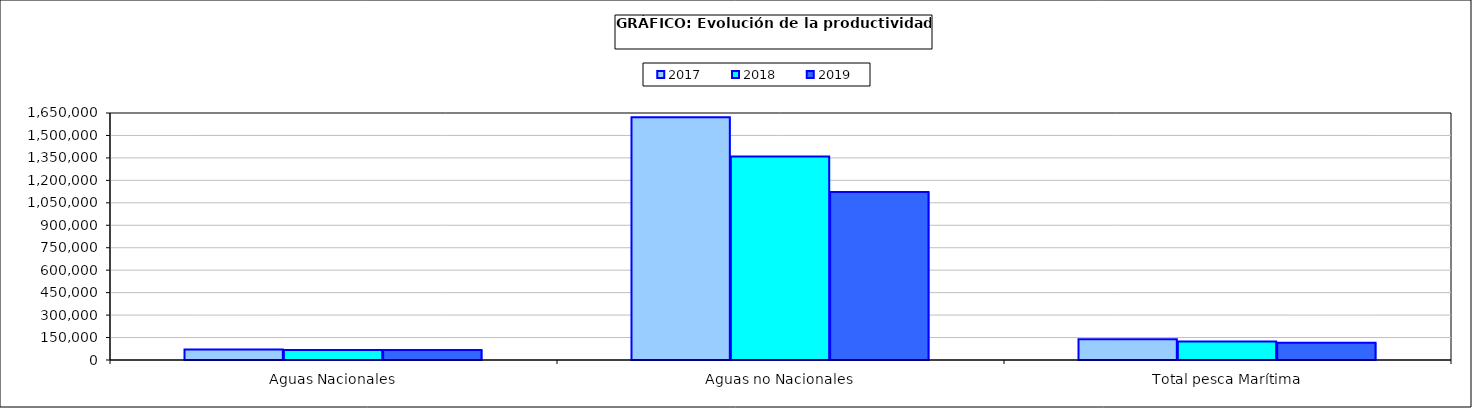
| Category | 2017 | 2018 | 2019 |
|---|---|---|---|
| 0 | 70669.255 | 67571.06 | 67190.989 |
| 1 | 1622080.15 | 1358789.456 | 1122087.946 |
| 2 | 139309.134 | 124192.189 | 114883.345 |